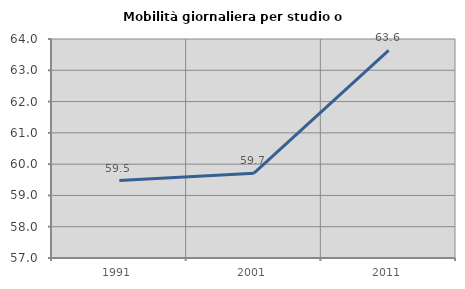
| Category | Mobilità giornaliera per studio o lavoro |
|---|---|
| 1991.0 | 59.474 |
| 2001.0 | 59.71 |
| 2011.0 | 63.636 |